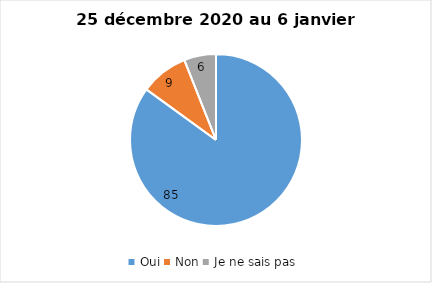
| Category | Series 0 |
|---|---|
| Oui | 85 |
| Non | 9 |
| Je ne sais pas | 6 |